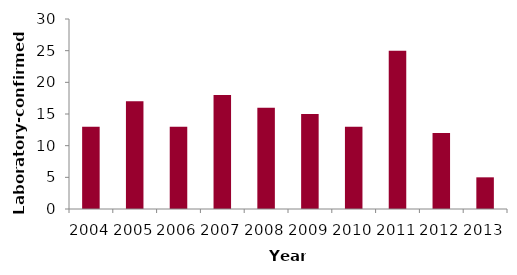
| Category | Total |
|---|---|
| 2004.0 | 13 |
| 2005.0 | 17 |
| 2006.0 | 13 |
| 2007.0 | 18 |
| 2008.0 | 16 |
| 2009.0 | 15 |
| 2010.0 | 13 |
| 2011.0 | 25 |
| 2012.0 | 12 |
| 2013.0 | 5 |